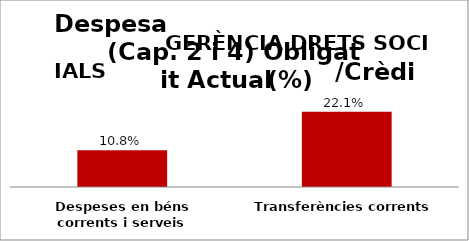
| Category | Series 0 |
|---|---|
| Despeses en béns corrents i serveis | 0.108 |
| Transferències corrents | 0.221 |